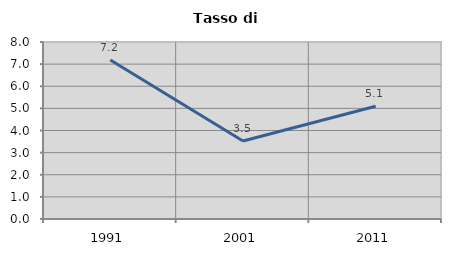
| Category | Tasso di disoccupazione   |
|---|---|
| 1991.0 | 7.182 |
| 2001.0 | 3.528 |
| 2011.0 | 5.096 |